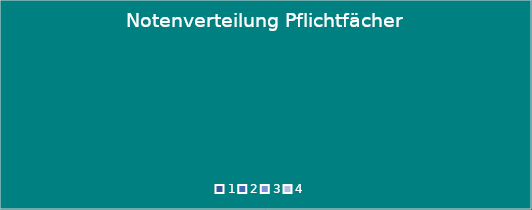
| Category | 1 |
|---|---|
| 0 | 0 |
| 1 | 0 |
| 2 | 0 |
| 3 | 0 |